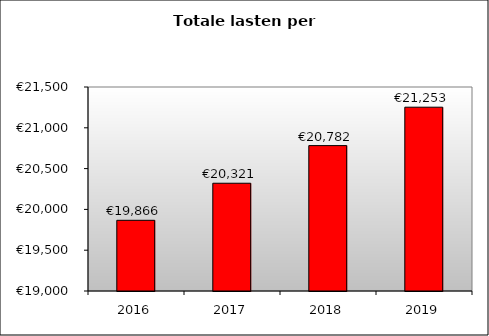
| Category | Series 0 |
|---|---|
| 2016.0 | 19866.444 |
| 2017.0 | 20320.546 |
| 2018.0 | 20781.858 |
| 2019.0 | 21252.59 |